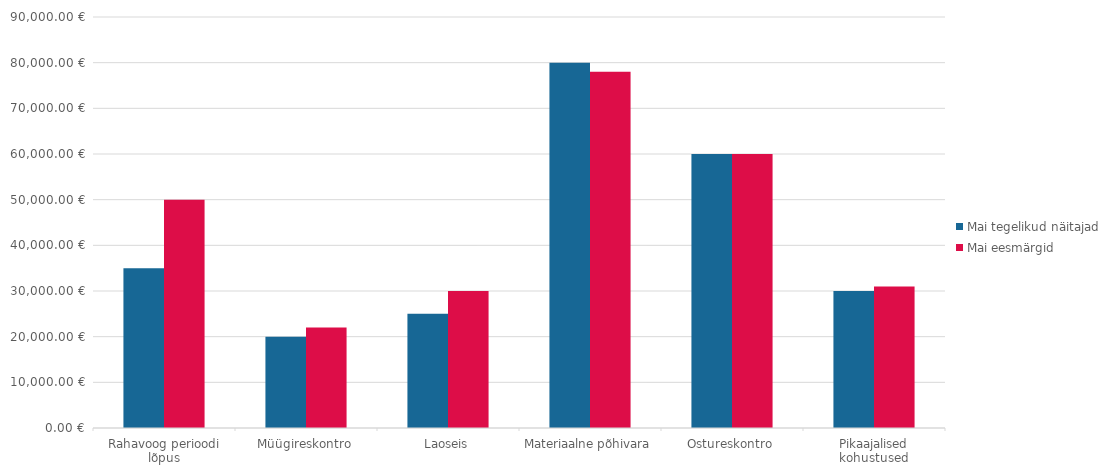
| Category | Mai tegelikud näitajad | Mai eesmärgid |
|---|---|---|
| Rahavoog perioodi lõpus | 35000 | 50000 |
| Müügireskontro | 20000 | 22000 |
| Laoseis | 25000 | 30000 |
| Materiaalne põhivara | 80000 | 78000 |
| Ostureskontro | 60000 | 60000 |
| Pikaajalised kohustused | 30000 | 31000 |